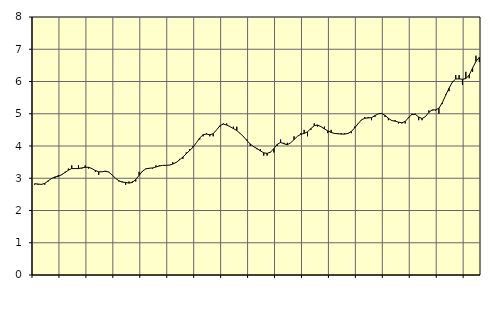
| Category | Piggar | Information och kommunikation, SNI 58-63 |
|---|---|---|
| nan | 2.8 | 2.83 |
| 87.0 | 2.8 | 2.82 |
| 87.0 | 2.8 | 2.81 |
| 87.0 | 2.8 | 2.84 |
| nan | 2.9 | 2.92 |
| 88.0 | 3 | 2.99 |
| 88.0 | 3 | 3.04 |
| 88.0 | 3.1 | 3.06 |
| nan | 3.1 | 3.11 |
| 89.0 | 3.2 | 3.18 |
| 89.0 | 3.3 | 3.25 |
| 89.0 | 3.4 | 3.3 |
| nan | 3.3 | 3.3 |
| 90.0 | 3.4 | 3.3 |
| 90.0 | 3.3 | 3.32 |
| 90.0 | 3.4 | 3.34 |
| nan | 3.3 | 3.34 |
| 91.0 | 3.3 | 3.3 |
| 91.0 | 3.2 | 3.24 |
| 91.0 | 3.1 | 3.2 |
| nan | 3.2 | 3.2 |
| 92.0 | 3.2 | 3.22 |
| 92.0 | 3.2 | 3.19 |
| 92.0 | 3.1 | 3.1 |
| nan | 3 | 3 |
| 93.0 | 2.9 | 2.92 |
| 93.0 | 2.9 | 2.88 |
| 93.0 | 2.8 | 2.87 |
| nan | 2.9 | 2.85 |
| 94.0 | 2.9 | 2.87 |
| 94.0 | 2.9 | 2.96 |
| 94.0 | 3.2 | 3.09 |
| nan | 3.2 | 3.22 |
| 95.0 | 3.3 | 3.29 |
| 95.0 | 3.3 | 3.31 |
| 95.0 | 3.3 | 3.32 |
| nan | 3.4 | 3.35 |
| 96.0 | 3.4 | 3.38 |
| 96.0 | 3.4 | 3.4 |
| 96.0 | 3.4 | 3.4 |
| nan | 3.4 | 3.41 |
| 97.0 | 3.5 | 3.44 |
| 97.0 | 3.5 | 3.49 |
| 97.0 | 3.6 | 3.57 |
| nan | 3.6 | 3.66 |
| 98.0 | 3.8 | 3.76 |
| 98.0 | 3.9 | 3.86 |
| 98.0 | 4 | 3.96 |
| nan | 4.1 | 4.1 |
| 99.0 | 4.2 | 4.25 |
| 99.0 | 4.3 | 4.35 |
| 99.0 | 4.4 | 4.37 |
| nan | 4.3 | 4.35 |
| 0.0 | 4.3 | 4.38 |
| 0.0 | 4.5 | 4.5 |
| 0.0 | 4.6 | 4.63 |
| nan | 4.7 | 4.68 |
| 1.0 | 4.7 | 4.65 |
| 1.0 | 4.6 | 4.6 |
| 1.0 | 4.6 | 4.54 |
| nan | 4.6 | 4.48 |
| 2.0 | 4.4 | 4.39 |
| 2.0 | 4.3 | 4.29 |
| 2.0 | 4.2 | 4.17 |
| nan | 4 | 4.06 |
| 3.0 | 4 | 3.98 |
| 3.0 | 3.9 | 3.92 |
| 3.0 | 3.9 | 3.85 |
| nan | 3.7 | 3.79 |
| 4.0 | 3.7 | 3.77 |
| 4.0 | 3.8 | 3.81 |
| 4.0 | 3.8 | 3.92 |
| nan | 4 | 4.05 |
| 5.0 | 4.2 | 4.11 |
| 5.0 | 4.1 | 4.07 |
| 5.0 | 4.1 | 4.04 |
| nan | 4.1 | 4.1 |
| 6.0 | 4.3 | 4.2 |
| 6.0 | 4.3 | 4.3 |
| 6.0 | 4.4 | 4.36 |
| nan | 4.5 | 4.39 |
| 7.0 | 4.3 | 4.44 |
| 7.0 | 4.5 | 4.54 |
| 7.0 | 4.7 | 4.63 |
| nan | 4.6 | 4.65 |
| 8.0 | 4.6 | 4.6 |
| 8.0 | 4.6 | 4.53 |
| 8.0 | 4.4 | 4.47 |
| nan | 4.5 | 4.42 |
| 9.0 | 4.4 | 4.39 |
| 9.0 | 4.4 | 4.38 |
| 9.0 | 4.4 | 4.37 |
| nan | 4.4 | 4.37 |
| 10.0 | 4.4 | 4.39 |
| 10.0 | 4.4 | 4.45 |
| 10.0 | 4.6 | 4.56 |
| nan | 4.7 | 4.69 |
| 11.0 | 4.8 | 4.81 |
| 11.0 | 4.9 | 4.86 |
| 11.0 | 4.9 | 4.87 |
| nan | 4.8 | 4.88 |
| 12.0 | 4.9 | 4.94 |
| 12.0 | 5 | 5 |
| 12.0 | 5 | 5.01 |
| nan | 4.9 | 4.95 |
| 13.0 | 4.8 | 4.86 |
| 13.0 | 4.8 | 4.79 |
| 13.0 | 4.8 | 4.77 |
| nan | 4.7 | 4.74 |
| 14.0 | 4.7 | 4.72 |
| 14.0 | 4.7 | 4.76 |
| 14.0 | 4.9 | 4.88 |
| nan | 5 | 4.98 |
| 15.0 | 5 | 4.98 |
| 15.0 | 4.8 | 4.9 |
| 15.0 | 4.8 | 4.85 |
| nan | 4.9 | 4.91 |
| 16.0 | 5.1 | 5.04 |
| 16.0 | 5.1 | 5.12 |
| 16.0 | 5.1 | 5.12 |
| nan | 5 | 5.17 |
| 17.0 | 5.3 | 5.34 |
| 17.0 | 5.6 | 5.57 |
| 17.0 | 5.7 | 5.79 |
| nan | 6 | 5.98 |
| 18.0 | 6.2 | 6.08 |
| 18.0 | 6.2 | 6.08 |
| 18.0 | 5.9 | 6.07 |
| nan | 6.3 | 6.09 |
| 19.0 | 6.1 | 6.2 |
| 19.0 | 6.3 | 6.42 |
| 19.0 | 6.8 | 6.62 |
| nan | 6.6 | 6.75 |